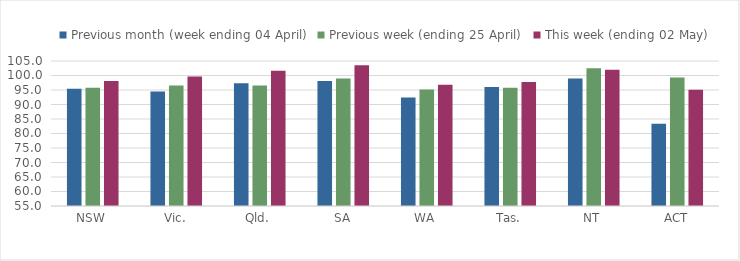
| Category | Previous month (week ending 04 April) | Previous week (ending 25 April) | This week (ending 02 May) |
|---|---|---|---|
| NSW | 95.408 | 95.79 | 98.089 |
| Vic. | 94.483 | 96.586 | 99.652 |
| Qld. | 97.321 | 96.514 | 101.672 |
| SA | 98.116 | 98.944 | 103.568 |
| WA | 92.376 | 95.146 | 96.848 |
| Tas. | 96.002 | 95.754 | 97.727 |
| NT | 98.991 | 102.494 | 101.966 |
| ACT | 83.368 | 99.31 | 95.073 |